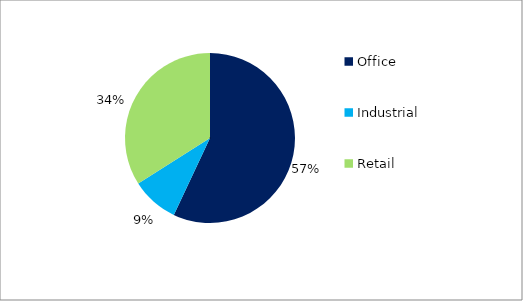
| Category | Series 0 |
|---|---|
| Office | 0.57 |
| Industrial  | 0.09 |
| Retail  | 0.34 |